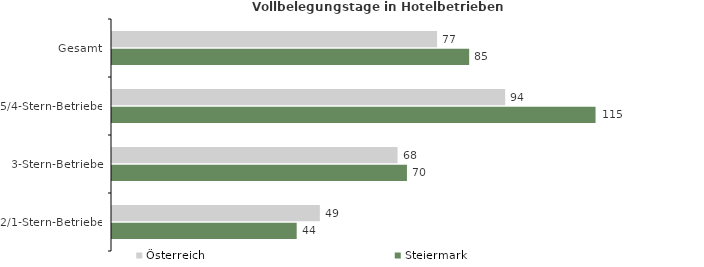
| Category | Österreich | Steiermark |
|---|---|---|
| Gesamt | 77.394 | 85.042 |
| 5/4-Stern-Betriebe | 93.608 | 115.133 |
| 3-Stern-Betriebe | 67.992 | 70.225 |
| 2/1-Stern-Betriebe | 49.488 | 43.973 |